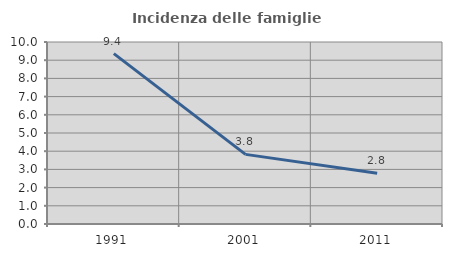
| Category | Incidenza delle famiglie numerose |
|---|---|
| 1991.0 | 9.361 |
| 2001.0 | 3.825 |
| 2011.0 | 2.791 |